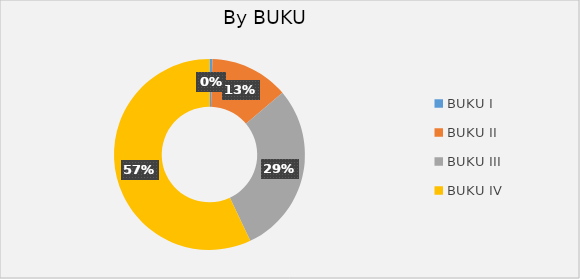
| Category | H. Deposits by BUKU |
|---|---|
| BUKU I  | 33.307 |
| BUKU II  | 891.614 |
| BUKU III  | 1950.851 |
| BUKU IV  | 3815.732 |